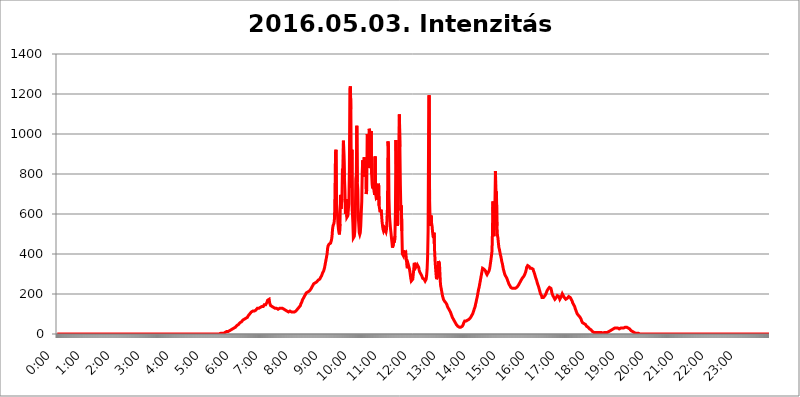
| Category | 2016.05.03. Intenzitás [W/m^2] |
|---|---|
| 0.0 | 0 |
| 0.0006944444444444445 | 0 |
| 0.001388888888888889 | 0 |
| 0.0020833333333333333 | 0 |
| 0.002777777777777778 | 0 |
| 0.003472222222222222 | 0 |
| 0.004166666666666667 | 0 |
| 0.004861111111111111 | 0 |
| 0.005555555555555556 | 0 |
| 0.0062499999999999995 | 0 |
| 0.006944444444444444 | 0 |
| 0.007638888888888889 | 0 |
| 0.008333333333333333 | 0 |
| 0.009027777777777779 | 0 |
| 0.009722222222222222 | 0 |
| 0.010416666666666666 | 0 |
| 0.011111111111111112 | 0 |
| 0.011805555555555555 | 0 |
| 0.012499999999999999 | 0 |
| 0.013194444444444444 | 0 |
| 0.013888888888888888 | 0 |
| 0.014583333333333332 | 0 |
| 0.015277777777777777 | 0 |
| 0.015972222222222224 | 0 |
| 0.016666666666666666 | 0 |
| 0.017361111111111112 | 0 |
| 0.018055555555555557 | 0 |
| 0.01875 | 0 |
| 0.019444444444444445 | 0 |
| 0.02013888888888889 | 0 |
| 0.020833333333333332 | 0 |
| 0.02152777777777778 | 0 |
| 0.022222222222222223 | 0 |
| 0.02291666666666667 | 0 |
| 0.02361111111111111 | 0 |
| 0.024305555555555556 | 0 |
| 0.024999999999999998 | 0 |
| 0.025694444444444447 | 0 |
| 0.02638888888888889 | 0 |
| 0.027083333333333334 | 0 |
| 0.027777777777777776 | 0 |
| 0.02847222222222222 | 0 |
| 0.029166666666666664 | 0 |
| 0.029861111111111113 | 0 |
| 0.030555555555555555 | 0 |
| 0.03125 | 0 |
| 0.03194444444444445 | 0 |
| 0.03263888888888889 | 0 |
| 0.03333333333333333 | 0 |
| 0.034027777777777775 | 0 |
| 0.034722222222222224 | 0 |
| 0.035416666666666666 | 0 |
| 0.036111111111111115 | 0 |
| 0.03680555555555556 | 0 |
| 0.0375 | 0 |
| 0.03819444444444444 | 0 |
| 0.03888888888888889 | 0 |
| 0.03958333333333333 | 0 |
| 0.04027777777777778 | 0 |
| 0.04097222222222222 | 0 |
| 0.041666666666666664 | 0 |
| 0.042361111111111106 | 0 |
| 0.04305555555555556 | 0 |
| 0.043750000000000004 | 0 |
| 0.044444444444444446 | 0 |
| 0.04513888888888889 | 0 |
| 0.04583333333333334 | 0 |
| 0.04652777777777778 | 0 |
| 0.04722222222222222 | 0 |
| 0.04791666666666666 | 0 |
| 0.04861111111111111 | 0 |
| 0.049305555555555554 | 0 |
| 0.049999999999999996 | 0 |
| 0.05069444444444445 | 0 |
| 0.051388888888888894 | 0 |
| 0.052083333333333336 | 0 |
| 0.05277777777777778 | 0 |
| 0.05347222222222222 | 0 |
| 0.05416666666666667 | 0 |
| 0.05486111111111111 | 0 |
| 0.05555555555555555 | 0 |
| 0.05625 | 0 |
| 0.05694444444444444 | 0 |
| 0.057638888888888885 | 0 |
| 0.05833333333333333 | 0 |
| 0.05902777777777778 | 0 |
| 0.059722222222222225 | 0 |
| 0.06041666666666667 | 0 |
| 0.061111111111111116 | 0 |
| 0.06180555555555556 | 0 |
| 0.0625 | 0 |
| 0.06319444444444444 | 0 |
| 0.06388888888888888 | 0 |
| 0.06458333333333334 | 0 |
| 0.06527777777777778 | 0 |
| 0.06597222222222222 | 0 |
| 0.06666666666666667 | 0 |
| 0.06736111111111111 | 0 |
| 0.06805555555555555 | 0 |
| 0.06874999999999999 | 0 |
| 0.06944444444444443 | 0 |
| 0.07013888888888889 | 0 |
| 0.07083333333333333 | 0 |
| 0.07152777777777779 | 0 |
| 0.07222222222222223 | 0 |
| 0.07291666666666667 | 0 |
| 0.07361111111111111 | 0 |
| 0.07430555555555556 | 0 |
| 0.075 | 0 |
| 0.07569444444444444 | 0 |
| 0.0763888888888889 | 0 |
| 0.07708333333333334 | 0 |
| 0.07777777777777778 | 0 |
| 0.07847222222222222 | 0 |
| 0.07916666666666666 | 0 |
| 0.0798611111111111 | 0 |
| 0.08055555555555556 | 0 |
| 0.08125 | 0 |
| 0.08194444444444444 | 0 |
| 0.08263888888888889 | 0 |
| 0.08333333333333333 | 0 |
| 0.08402777777777777 | 0 |
| 0.08472222222222221 | 0 |
| 0.08541666666666665 | 0 |
| 0.08611111111111112 | 0 |
| 0.08680555555555557 | 0 |
| 0.08750000000000001 | 0 |
| 0.08819444444444445 | 0 |
| 0.08888888888888889 | 0 |
| 0.08958333333333333 | 0 |
| 0.09027777777777778 | 0 |
| 0.09097222222222222 | 0 |
| 0.09166666666666667 | 0 |
| 0.09236111111111112 | 0 |
| 0.09305555555555556 | 0 |
| 0.09375 | 0 |
| 0.09444444444444444 | 0 |
| 0.09513888888888888 | 0 |
| 0.09583333333333333 | 0 |
| 0.09652777777777777 | 0 |
| 0.09722222222222222 | 0 |
| 0.09791666666666667 | 0 |
| 0.09861111111111111 | 0 |
| 0.09930555555555555 | 0 |
| 0.09999999999999999 | 0 |
| 0.10069444444444443 | 0 |
| 0.1013888888888889 | 0 |
| 0.10208333333333335 | 0 |
| 0.10277777777777779 | 0 |
| 0.10347222222222223 | 0 |
| 0.10416666666666667 | 0 |
| 0.10486111111111111 | 0 |
| 0.10555555555555556 | 0 |
| 0.10625 | 0 |
| 0.10694444444444444 | 0 |
| 0.1076388888888889 | 0 |
| 0.10833333333333334 | 0 |
| 0.10902777777777778 | 0 |
| 0.10972222222222222 | 0 |
| 0.1111111111111111 | 0 |
| 0.11180555555555556 | 0 |
| 0.11180555555555556 | 0 |
| 0.1125 | 0 |
| 0.11319444444444444 | 0 |
| 0.11388888888888889 | 0 |
| 0.11458333333333333 | 0 |
| 0.11527777777777777 | 0 |
| 0.11597222222222221 | 0 |
| 0.11666666666666665 | 0 |
| 0.1173611111111111 | 0 |
| 0.11805555555555557 | 0 |
| 0.11944444444444445 | 0 |
| 0.12013888888888889 | 0 |
| 0.12083333333333333 | 0 |
| 0.12152777777777778 | 0 |
| 0.12222222222222223 | 0 |
| 0.12291666666666667 | 0 |
| 0.12291666666666667 | 0 |
| 0.12361111111111112 | 0 |
| 0.12430555555555556 | 0 |
| 0.125 | 0 |
| 0.12569444444444444 | 0 |
| 0.12638888888888888 | 0 |
| 0.12708333333333333 | 0 |
| 0.16875 | 0 |
| 0.12847222222222224 | 0 |
| 0.12916666666666668 | 0 |
| 0.12986111111111112 | 0 |
| 0.13055555555555556 | 0 |
| 0.13125 | 0 |
| 0.13194444444444445 | 0 |
| 0.1326388888888889 | 0 |
| 0.13333333333333333 | 0 |
| 0.13402777777777777 | 0 |
| 0.13402777777777777 | 0 |
| 0.13472222222222222 | 0 |
| 0.13541666666666666 | 0 |
| 0.1361111111111111 | 0 |
| 0.13749999999999998 | 0 |
| 0.13819444444444443 | 0 |
| 0.1388888888888889 | 0 |
| 0.13958333333333334 | 0 |
| 0.14027777777777778 | 0 |
| 0.14097222222222222 | 0 |
| 0.14166666666666666 | 0 |
| 0.1423611111111111 | 0 |
| 0.14305555555555557 | 0 |
| 0.14375000000000002 | 0 |
| 0.14444444444444446 | 0 |
| 0.1451388888888889 | 0 |
| 0.1451388888888889 | 0 |
| 0.14652777777777778 | 0 |
| 0.14722222222222223 | 0 |
| 0.14791666666666667 | 0 |
| 0.1486111111111111 | 0 |
| 0.14930555555555555 | 0 |
| 0.15 | 0 |
| 0.15069444444444444 | 0 |
| 0.15138888888888888 | 0 |
| 0.15208333333333332 | 0 |
| 0.15277777777777776 | 0 |
| 0.15347222222222223 | 0 |
| 0.15416666666666667 | 0 |
| 0.15486111111111112 | 0 |
| 0.15555555555555556 | 0 |
| 0.15625 | 0 |
| 0.15694444444444444 | 0 |
| 0.15763888888888888 | 0 |
| 0.15833333333333333 | 0 |
| 0.15902777777777777 | 0 |
| 0.15972222222222224 | 0 |
| 0.16041666666666668 | 0 |
| 0.16111111111111112 | 0 |
| 0.16180555555555556 | 0 |
| 0.1625 | 0 |
| 0.16319444444444445 | 0 |
| 0.1638888888888889 | 0 |
| 0.16458333333333333 | 0 |
| 0.16527777777777777 | 0 |
| 0.16597222222222222 | 0 |
| 0.16666666666666666 | 0 |
| 0.1673611111111111 | 0 |
| 0.16805555555555554 | 0 |
| 0.16874999999999998 | 0 |
| 0.16944444444444443 | 0 |
| 0.17013888888888887 | 0 |
| 0.1708333333333333 | 0 |
| 0.17152777777777775 | 0 |
| 0.17222222222222225 | 0 |
| 0.1729166666666667 | 0 |
| 0.17361111111111113 | 0 |
| 0.17430555555555557 | 0 |
| 0.17500000000000002 | 0 |
| 0.17569444444444446 | 0 |
| 0.1763888888888889 | 0 |
| 0.17708333333333334 | 0 |
| 0.17777777777777778 | 0 |
| 0.17847222222222223 | 0 |
| 0.17916666666666667 | 0 |
| 0.1798611111111111 | 0 |
| 0.18055555555555555 | 0 |
| 0.18125 | 0 |
| 0.18194444444444444 | 0 |
| 0.1826388888888889 | 0 |
| 0.18333333333333335 | 0 |
| 0.1840277777777778 | 0 |
| 0.18472222222222223 | 0 |
| 0.18541666666666667 | 0 |
| 0.18611111111111112 | 0 |
| 0.18680555555555556 | 0 |
| 0.1875 | 0 |
| 0.18819444444444444 | 0 |
| 0.18888888888888888 | 0 |
| 0.18958333333333333 | 0 |
| 0.19027777777777777 | 0 |
| 0.1909722222222222 | 0 |
| 0.19166666666666665 | 0 |
| 0.19236111111111112 | 0 |
| 0.19305555555555554 | 0 |
| 0.19375 | 0 |
| 0.19444444444444445 | 0 |
| 0.1951388888888889 | 0 |
| 0.19583333333333333 | 0 |
| 0.19652777777777777 | 0 |
| 0.19722222222222222 | 0 |
| 0.19791666666666666 | 0 |
| 0.1986111111111111 | 0 |
| 0.19930555555555554 | 0 |
| 0.19999999999999998 | 0 |
| 0.20069444444444443 | 0 |
| 0.20138888888888887 | 0 |
| 0.2020833333333333 | 0 |
| 0.2027777777777778 | 0 |
| 0.2034722222222222 | 0 |
| 0.2041666666666667 | 0 |
| 0.20486111111111113 | 0 |
| 0.20555555555555557 | 0 |
| 0.20625000000000002 | 0 |
| 0.20694444444444446 | 0 |
| 0.2076388888888889 | 0 |
| 0.20833333333333334 | 0 |
| 0.20902777777777778 | 0 |
| 0.20972222222222223 | 0 |
| 0.21041666666666667 | 0 |
| 0.2111111111111111 | 0 |
| 0.21180555555555555 | 0 |
| 0.2125 | 0 |
| 0.21319444444444444 | 0 |
| 0.2138888888888889 | 0 |
| 0.21458333333333335 | 0 |
| 0.2152777777777778 | 0 |
| 0.21597222222222223 | 0 |
| 0.21666666666666667 | 0 |
| 0.21736111111111112 | 0 |
| 0.21805555555555556 | 0 |
| 0.21875 | 0 |
| 0.21944444444444444 | 0 |
| 0.22013888888888888 | 0 |
| 0.22083333333333333 | 0 |
| 0.22152777777777777 | 0 |
| 0.2222222222222222 | 0 |
| 0.22291666666666665 | 0 |
| 0.2236111111111111 | 0 |
| 0.22430555555555556 | 0 |
| 0.225 | 0 |
| 0.22569444444444445 | 3.525 |
| 0.2263888888888889 | 0 |
| 0.22708333333333333 | 0 |
| 0.22777777777777777 | 3.525 |
| 0.22847222222222222 | 3.525 |
| 0.22916666666666666 | 3.525 |
| 0.2298611111111111 | 3.525 |
| 0.23055555555555554 | 3.525 |
| 0.23124999999999998 | 3.525 |
| 0.23194444444444443 | 3.525 |
| 0.23263888888888887 | 3.525 |
| 0.2333333333333333 | 3.525 |
| 0.2340277777777778 | 3.525 |
| 0.2347222222222222 | 7.887 |
| 0.2354166666666667 | 7.887 |
| 0.23611111111111113 | 7.887 |
| 0.23680555555555557 | 7.887 |
| 0.23750000000000002 | 12.257 |
| 0.23819444444444446 | 12.257 |
| 0.2388888888888889 | 12.257 |
| 0.23958333333333334 | 12.257 |
| 0.24027777777777778 | 12.257 |
| 0.24097222222222223 | 12.257 |
| 0.24166666666666667 | 16.636 |
| 0.2423611111111111 | 16.636 |
| 0.24305555555555555 | 16.636 |
| 0.24375 | 21.024 |
| 0.24444444444444446 | 21.024 |
| 0.24513888888888888 | 25.419 |
| 0.24583333333333335 | 25.419 |
| 0.2465277777777778 | 25.419 |
| 0.24722222222222223 | 29.823 |
| 0.24791666666666667 | 29.823 |
| 0.24861111111111112 | 34.234 |
| 0.24930555555555556 | 34.234 |
| 0.25 | 34.234 |
| 0.25069444444444444 | 38.653 |
| 0.2513888888888889 | 38.653 |
| 0.2520833333333333 | 43.079 |
| 0.25277777777777777 | 43.079 |
| 0.2534722222222222 | 47.511 |
| 0.25416666666666665 | 47.511 |
| 0.2548611111111111 | 47.511 |
| 0.2555555555555556 | 51.951 |
| 0.25625000000000003 | 56.398 |
| 0.2569444444444445 | 56.398 |
| 0.2576388888888889 | 60.85 |
| 0.25833333333333336 | 60.85 |
| 0.2590277777777778 | 65.31 |
| 0.25972222222222224 | 65.31 |
| 0.2604166666666667 | 69.775 |
| 0.2611111111111111 | 69.775 |
| 0.26180555555555557 | 74.246 |
| 0.2625 | 74.246 |
| 0.26319444444444445 | 74.246 |
| 0.2638888888888889 | 74.246 |
| 0.26458333333333334 | 78.722 |
| 0.2652777777777778 | 78.722 |
| 0.2659722222222222 | 83.205 |
| 0.26666666666666666 | 83.205 |
| 0.2673611111111111 | 87.692 |
| 0.26805555555555555 | 92.184 |
| 0.26875 | 92.184 |
| 0.26944444444444443 | 96.682 |
| 0.2701388888888889 | 101.184 |
| 0.2708333333333333 | 101.184 |
| 0.27152777777777776 | 105.69 |
| 0.2722222222222222 | 110.201 |
| 0.27291666666666664 | 110.201 |
| 0.2736111111111111 | 110.201 |
| 0.2743055555555555 | 114.716 |
| 0.27499999999999997 | 114.716 |
| 0.27569444444444446 | 114.716 |
| 0.27638888888888885 | 114.716 |
| 0.27708333333333335 | 119.235 |
| 0.2777777777777778 | 119.235 |
| 0.27847222222222223 | 119.235 |
| 0.2791666666666667 | 123.758 |
| 0.2798611111111111 | 123.758 |
| 0.28055555555555556 | 128.284 |
| 0.28125 | 128.284 |
| 0.28194444444444444 | 128.284 |
| 0.2826388888888889 | 128.284 |
| 0.2833333333333333 | 128.284 |
| 0.28402777777777777 | 128.284 |
| 0.2847222222222222 | 132.814 |
| 0.28541666666666665 | 132.814 |
| 0.28611111111111115 | 132.814 |
| 0.28680555555555554 | 137.347 |
| 0.28750000000000003 | 137.347 |
| 0.2881944444444445 | 137.347 |
| 0.2888888888888889 | 137.347 |
| 0.28958333333333336 | 141.884 |
| 0.2902777777777778 | 146.423 |
| 0.29097222222222224 | 146.423 |
| 0.2916666666666667 | 146.423 |
| 0.2923611111111111 | 146.423 |
| 0.29305555555555557 | 150.964 |
| 0.29375 | 155.509 |
| 0.29444444444444445 | 160.056 |
| 0.2951388888888889 | 169.156 |
| 0.29583333333333334 | 173.709 |
| 0.2965277777777778 | 173.709 |
| 0.2972222222222222 | 173.709 |
| 0.29791666666666666 | 155.509 |
| 0.2986111111111111 | 150.964 |
| 0.29930555555555555 | 141.884 |
| 0.3 | 141.884 |
| 0.30069444444444443 | 137.347 |
| 0.3013888888888889 | 137.347 |
| 0.3020833333333333 | 132.814 |
| 0.30277777777777776 | 132.814 |
| 0.3034722222222222 | 132.814 |
| 0.30416666666666664 | 132.814 |
| 0.3048611111111111 | 128.284 |
| 0.3055555555555555 | 128.284 |
| 0.30624999999999997 | 128.284 |
| 0.3069444444444444 | 128.284 |
| 0.3076388888888889 | 128.284 |
| 0.30833333333333335 | 128.284 |
| 0.3090277777777778 | 128.284 |
| 0.30972222222222223 | 123.758 |
| 0.3104166666666667 | 123.758 |
| 0.3111111111111111 | 123.758 |
| 0.31180555555555556 | 128.284 |
| 0.3125 | 123.758 |
| 0.31319444444444444 | 128.284 |
| 0.3138888888888889 | 128.284 |
| 0.3145833333333333 | 128.284 |
| 0.31527777777777777 | 128.284 |
| 0.3159722222222222 | 128.284 |
| 0.31666666666666665 | 123.758 |
| 0.31736111111111115 | 123.758 |
| 0.31805555555555554 | 123.758 |
| 0.31875000000000003 | 119.235 |
| 0.3194444444444445 | 119.235 |
| 0.3201388888888889 | 119.235 |
| 0.32083333333333336 | 119.235 |
| 0.3215277777777778 | 114.716 |
| 0.32222222222222224 | 114.716 |
| 0.3229166666666667 | 114.716 |
| 0.3236111111111111 | 114.716 |
| 0.32430555555555557 | 110.201 |
| 0.325 | 114.716 |
| 0.32569444444444445 | 114.716 |
| 0.3263888888888889 | 114.716 |
| 0.32708333333333334 | 114.716 |
| 0.3277777777777778 | 114.716 |
| 0.3284722222222222 | 110.201 |
| 0.32916666666666666 | 110.201 |
| 0.3298611111111111 | 110.201 |
| 0.33055555555555555 | 110.201 |
| 0.33125 | 110.201 |
| 0.33194444444444443 | 110.201 |
| 0.3326388888888889 | 110.201 |
| 0.3333333333333333 | 110.201 |
| 0.3340277777777778 | 114.716 |
| 0.3347222222222222 | 114.716 |
| 0.3354166666666667 | 119.235 |
| 0.3361111111111111 | 119.235 |
| 0.3368055555555556 | 123.758 |
| 0.33749999999999997 | 128.284 |
| 0.33819444444444446 | 128.284 |
| 0.33888888888888885 | 132.814 |
| 0.33958333333333335 | 132.814 |
| 0.34027777777777773 | 137.347 |
| 0.34097222222222223 | 141.884 |
| 0.3416666666666666 | 150.964 |
| 0.3423611111111111 | 155.509 |
| 0.3430555555555555 | 160.056 |
| 0.34375 | 169.156 |
| 0.3444444444444445 | 173.709 |
| 0.3451388888888889 | 178.264 |
| 0.3458333333333334 | 182.82 |
| 0.34652777777777777 | 187.378 |
| 0.34722222222222227 | 191.937 |
| 0.34791666666666665 | 196.497 |
| 0.34861111111111115 | 201.058 |
| 0.34930555555555554 | 205.62 |
| 0.35000000000000003 | 210.182 |
| 0.3506944444444444 | 210.182 |
| 0.3513888888888889 | 210.182 |
| 0.3520833333333333 | 214.746 |
| 0.3527777777777778 | 214.746 |
| 0.3534722222222222 | 214.746 |
| 0.3541666666666667 | 219.309 |
| 0.3548611111111111 | 219.309 |
| 0.35555555555555557 | 223.873 |
| 0.35625 | 228.436 |
| 0.35694444444444445 | 233 |
| 0.3576388888888889 | 237.564 |
| 0.35833333333333334 | 242.127 |
| 0.3590277777777778 | 246.689 |
| 0.3597222222222222 | 251.251 |
| 0.36041666666666666 | 251.251 |
| 0.3611111111111111 | 255.813 |
| 0.36180555555555555 | 255.813 |
| 0.3625 | 255.813 |
| 0.36319444444444443 | 255.813 |
| 0.3638888888888889 | 260.373 |
| 0.3645833333333333 | 260.373 |
| 0.3652777777777778 | 264.932 |
| 0.3659722222222222 | 269.49 |
| 0.3666666666666667 | 269.49 |
| 0.3673611111111111 | 269.49 |
| 0.3680555555555556 | 274.047 |
| 0.36874999999999997 | 278.603 |
| 0.36944444444444446 | 283.156 |
| 0.37013888888888885 | 287.709 |
| 0.37083333333333335 | 292.259 |
| 0.37152777777777773 | 296.808 |
| 0.37222222222222223 | 305.898 |
| 0.3729166666666666 | 310.44 |
| 0.3736111111111111 | 314.98 |
| 0.3743055555555555 | 324.052 |
| 0.375 | 333.113 |
| 0.3756944444444445 | 346.682 |
| 0.3763888888888889 | 360.221 |
| 0.3770833333333334 | 373.729 |
| 0.37777777777777777 | 387.202 |
| 0.37847222222222227 | 400.638 |
| 0.37916666666666665 | 427.39 |
| 0.37986111111111115 | 440.702 |
| 0.38055555555555554 | 445.129 |
| 0.38125000000000003 | 449.551 |
| 0.3819444444444444 | 453.968 |
| 0.3826388888888889 | 453.968 |
| 0.3833333333333333 | 453.968 |
| 0.3840277777777778 | 458.38 |
| 0.3847222222222222 | 471.582 |
| 0.3854166666666667 | 489.108 |
| 0.3861111111111111 | 523.88 |
| 0.38680555555555557 | 541.121 |
| 0.3875 | 545.416 |
| 0.38819444444444445 | 553.986 |
| 0.3888888888888889 | 579.542 |
| 0.38958333333333334 | 711.832 |
| 0.3902777777777778 | 906.223 |
| 0.3909722222222222 | 921.298 |
| 0.39166666666666666 | 650.667 |
| 0.3923611111111111 | 654.791 |
| 0.39305555555555555 | 596.45 |
| 0.39375 | 549.704 |
| 0.39444444444444443 | 523.88 |
| 0.3951388888888889 | 506.542 |
| 0.3958333333333333 | 497.836 |
| 0.3965277777777778 | 549.704 |
| 0.3972222222222222 | 695.666 |
| 0.3979166666666667 | 625.784 |
| 0.3986111111111111 | 629.948 |
| 0.3993055555555556 | 675.311 |
| 0.39999999999999997 | 826.123 |
| 0.40069444444444446 | 751.803 |
| 0.40138888888888885 | 966.295 |
| 0.40208333333333335 | 962.555 |
| 0.40277777777777773 | 783.342 |
| 0.40347222222222223 | 719.877 |
| 0.4041666666666666 | 600.661 |
| 0.4048611111111111 | 625.784 |
| 0.4055555555555555 | 675.311 |
| 0.40625 | 583.779 |
| 0.4069444444444445 | 579.542 |
| 0.4076388888888889 | 592.233 |
| 0.4083333333333334 | 625.784 |
| 0.40902777777777777 | 650.667 |
| 0.40972222222222227 | 818.392 |
| 0.41041666666666665 | 1225.859 |
| 0.41111111111111115 | 1238.014 |
| 0.41180555555555554 | 1124.056 |
| 0.41250000000000003 | 731.896 |
| 0.4131944444444444 | 921.298 |
| 0.4138888888888889 | 613.252 |
| 0.4145833333333333 | 558.261 |
| 0.4152777777777778 | 480.356 |
| 0.4159722222222222 | 480.356 |
| 0.4166666666666667 | 489.108 |
| 0.4173611111111111 | 515.223 |
| 0.41805555555555557 | 583.779 |
| 0.41875 | 775.492 |
| 0.41944444444444445 | 795.074 |
| 0.4201388888888889 | 1041.019 |
| 0.42083333333333334 | 759.723 |
| 0.4215277777777778 | 723.889 |
| 0.4222222222222222 | 588.009 |
| 0.42291666666666666 | 545.416 |
| 0.4236111111111111 | 506.542 |
| 0.42430555555555555 | 497.836 |
| 0.425 | 506.542 |
| 0.42569444444444443 | 541.121 |
| 0.4263888888888889 | 604.864 |
| 0.4270833333333333 | 663.019 |
| 0.4277777777777778 | 810.641 |
| 0.4284722222222222 | 868.305 |
| 0.4291666666666667 | 787.258 |
| 0.4298611111111111 | 810.641 |
| 0.4305555555555556 | 883.516 |
| 0.43124999999999997 | 818.392 |
| 0.43194444444444446 | 864.493 |
| 0.43263888888888885 | 853.029 |
| 0.43333333333333335 | 699.717 |
| 0.43402777777777773 | 719.877 |
| 0.43472222222222223 | 999.916 |
| 0.4354166666666666 | 988.714 |
| 0.4361111111111111 | 829.981 |
| 0.4368055555555555 | 845.365 |
| 0.4375 | 1026.06 |
| 0.4381944444444445 | 1014.852 |
| 0.4388888888888889 | 829.981 |
| 0.4395833333333334 | 883.516 |
| 0.44027777777777777 | 1014.852 |
| 0.44097222222222227 | 798.974 |
| 0.44166666666666665 | 747.834 |
| 0.44236111111111115 | 727.896 |
| 0.44305555555555554 | 755.766 |
| 0.44375000000000003 | 727.896 |
| 0.4444444444444444 | 711.832 |
| 0.4451388888888889 | 695.666 |
| 0.4458333333333333 | 887.309 |
| 0.4465277777777778 | 699.717 |
| 0.4472222222222222 | 683.473 |
| 0.4479166666666667 | 679.395 |
| 0.4486111111111111 | 691.608 |
| 0.44930555555555557 | 671.22 |
| 0.45 | 679.395 |
| 0.45069444444444445 | 751.803 |
| 0.4513888888888889 | 642.4 |
| 0.45208333333333334 | 625.784 |
| 0.4527777777777778 | 609.062 |
| 0.4534722222222222 | 609.062 |
| 0.45416666666666666 | 621.613 |
| 0.4548611111111111 | 596.45 |
| 0.45555555555555555 | 562.53 |
| 0.45625 | 541.121 |
| 0.45694444444444443 | 523.88 |
| 0.4576388888888889 | 515.223 |
| 0.4583333333333333 | 519.555 |
| 0.4590277777777778 | 528.2 |
| 0.4597222222222222 | 532.513 |
| 0.4604166666666667 | 523.88 |
| 0.4611111111111111 | 510.885 |
| 0.4618055555555556 | 523.88 |
| 0.46249999999999997 | 575.299 |
| 0.46319444444444446 | 634.105 |
| 0.46388888888888885 | 962.555 |
| 0.46458333333333335 | 932.576 |
| 0.46527777777777773 | 675.311 |
| 0.46597222222222223 | 592.233 |
| 0.4666666666666666 | 558.261 |
| 0.4673611111111111 | 528.2 |
| 0.4680555555555555 | 506.542 |
| 0.46875 | 480.356 |
| 0.4694444444444445 | 458.38 |
| 0.4701388888888889 | 431.833 |
| 0.4708333333333334 | 431.833 |
| 0.47152777777777777 | 449.551 |
| 0.47222222222222227 | 480.356 |
| 0.47291666666666665 | 458.38 |
| 0.47361111111111115 | 489.108 |
| 0.47430555555555554 | 613.252 |
| 0.47500000000000003 | 970.034 |
| 0.4756944444444444 | 837.682 |
| 0.4763888888888889 | 617.436 |
| 0.4770833333333333 | 541.121 |
| 0.4777777777777778 | 553.986 |
| 0.4784722222222222 | 822.26 |
| 0.4791666666666667 | 814.519 |
| 0.4798611111111111 | 1097.437 |
| 0.48055555555555557 | 936.33 |
| 0.48125 | 743.859 |
| 0.48194444444444445 | 617.436 |
| 0.4826388888888889 | 642.4 |
| 0.48333333333333334 | 515.223 |
| 0.4840277777777778 | 400.638 |
| 0.4847222222222222 | 400.638 |
| 0.48541666666666666 | 391.685 |
| 0.4861111111111111 | 418.492 |
| 0.48680555555555555 | 396.164 |
| 0.4875 | 396.164 |
| 0.48819444444444443 | 400.638 |
| 0.4888888888888889 | 405.108 |
| 0.4895833333333333 | 378.224 |
| 0.4902777777777778 | 346.682 |
| 0.4909722222222222 | 328.584 |
| 0.4916666666666667 | 337.639 |
| 0.4923611111111111 | 346.682 |
| 0.4930555555555556 | 337.639 |
| 0.49374999999999997 | 328.584 |
| 0.49444444444444446 | 314.98 |
| 0.49513888888888885 | 296.808 |
| 0.49583333333333335 | 278.603 |
| 0.49652777777777773 | 264.932 |
| 0.49722222222222223 | 260.373 |
| 0.4979166666666666 | 260.373 |
| 0.4986111111111111 | 274.047 |
| 0.4993055555555555 | 296.808 |
| 0.5 | 324.052 |
| 0.5006944444444444 | 355.712 |
| 0.5013888888888889 | 360.221 |
| 0.5020833333333333 | 342.162 |
| 0.5027777777777778 | 333.113 |
| 0.5034722222222222 | 333.113 |
| 0.5041666666666667 | 337.639 |
| 0.5048611111111111 | 346.682 |
| 0.5055555555555555 | 351.198 |
| 0.50625 | 346.682 |
| 0.5069444444444444 | 333.113 |
| 0.5076388888888889 | 319.517 |
| 0.5083333333333333 | 310.44 |
| 0.5090277777777777 | 305.898 |
| 0.5097222222222222 | 301.354 |
| 0.5104166666666666 | 296.808 |
| 0.5111111111111112 | 292.259 |
| 0.5118055555555555 | 287.709 |
| 0.5125000000000001 | 278.603 |
| 0.5131944444444444 | 278.603 |
| 0.513888888888889 | 278.603 |
| 0.5145833333333333 | 274.047 |
| 0.5152777777777778 | 269.49 |
| 0.5159722222222222 | 264.932 |
| 0.5166666666666667 | 264.932 |
| 0.517361111111111 | 274.047 |
| 0.5180555555555556 | 292.259 |
| 0.5187499999999999 | 324.052 |
| 0.5194444444444445 | 387.202 |
| 0.5201388888888888 | 515.223 |
| 0.5208333333333334 | 1003.65 |
| 0.5215277777777778 | 1193.918 |
| 0.5222222222222223 | 671.22 |
| 0.5229166666666667 | 571.049 |
| 0.5236111111111111 | 541.121 |
| 0.5243055555555556 | 592.233 |
| 0.525 | 553.986 |
| 0.5256944444444445 | 541.121 |
| 0.5263888888888889 | 510.885 |
| 0.5270833333333333 | 489.108 |
| 0.5277777777777778 | 480.356 |
| 0.5284722222222222 | 506.542 |
| 0.5291666666666667 | 422.943 |
| 0.5298611111111111 | 369.23 |
| 0.5305555555555556 | 333.113 |
| 0.53125 | 301.354 |
| 0.5319444444444444 | 274.047 |
| 0.5326388888888889 | 274.047 |
| 0.5333333333333333 | 287.709 |
| 0.5340277777777778 | 333.113 |
| 0.5347222222222222 | 364.728 |
| 0.5354166666666667 | 364.728 |
| 0.5361111111111111 | 351.198 |
| 0.5368055555555555 | 296.808 |
| 0.5375 | 246.689 |
| 0.5381944444444444 | 233 |
| 0.5388888888888889 | 219.309 |
| 0.5395833333333333 | 205.62 |
| 0.5402777777777777 | 191.937 |
| 0.5409722222222222 | 182.82 |
| 0.5416666666666666 | 173.709 |
| 0.5423611111111112 | 169.156 |
| 0.5430555555555555 | 164.605 |
| 0.5437500000000001 | 164.605 |
| 0.5444444444444444 | 160.056 |
| 0.545138888888889 | 155.509 |
| 0.5458333333333333 | 150.964 |
| 0.5465277777777778 | 146.423 |
| 0.5472222222222222 | 137.347 |
| 0.5479166666666667 | 137.347 |
| 0.548611111111111 | 128.284 |
| 0.5493055555555556 | 128.284 |
| 0.5499999999999999 | 119.235 |
| 0.5506944444444445 | 114.716 |
| 0.5513888888888888 | 110.201 |
| 0.5520833333333334 | 105.69 |
| 0.5527777777777778 | 96.682 |
| 0.5534722222222223 | 92.184 |
| 0.5541666666666667 | 83.205 |
| 0.5548611111111111 | 78.722 |
| 0.5555555555555556 | 74.246 |
| 0.55625 | 69.775 |
| 0.5569444444444445 | 65.31 |
| 0.5576388888888889 | 60.85 |
| 0.5583333333333333 | 56.398 |
| 0.5590277777777778 | 51.951 |
| 0.5597222222222222 | 47.511 |
| 0.5604166666666667 | 47.511 |
| 0.5611111111111111 | 43.079 |
| 0.5618055555555556 | 38.653 |
| 0.5625 | 38.653 |
| 0.5631944444444444 | 38.653 |
| 0.5638888888888889 | 34.234 |
| 0.5645833333333333 | 29.823 |
| 0.5652777777777778 | 29.823 |
| 0.5659722222222222 | 34.234 |
| 0.5666666666666667 | 34.234 |
| 0.5673611111111111 | 34.234 |
| 0.5680555555555555 | 38.653 |
| 0.56875 | 43.079 |
| 0.5694444444444444 | 47.511 |
| 0.5701388888888889 | 56.398 |
| 0.5708333333333333 | 60.85 |
| 0.5715277777777777 | 65.31 |
| 0.5722222222222222 | 65.31 |
| 0.5729166666666666 | 65.31 |
| 0.5736111111111112 | 65.31 |
| 0.5743055555555555 | 65.31 |
| 0.5750000000000001 | 65.31 |
| 0.5756944444444444 | 69.775 |
| 0.576388888888889 | 69.775 |
| 0.5770833333333333 | 74.246 |
| 0.5777777777777778 | 74.246 |
| 0.5784722222222222 | 78.722 |
| 0.5791666666666667 | 78.722 |
| 0.579861111111111 | 83.205 |
| 0.5805555555555556 | 87.692 |
| 0.5812499999999999 | 92.184 |
| 0.5819444444444445 | 96.682 |
| 0.5826388888888888 | 101.184 |
| 0.5833333333333334 | 105.69 |
| 0.5840277777777778 | 114.716 |
| 0.5847222222222223 | 123.758 |
| 0.5854166666666667 | 128.284 |
| 0.5861111111111111 | 137.347 |
| 0.5868055555555556 | 150.964 |
| 0.5875 | 160.056 |
| 0.5881944444444445 | 173.709 |
| 0.5888888888888889 | 182.82 |
| 0.5895833333333333 | 196.497 |
| 0.5902777777777778 | 210.182 |
| 0.5909722222222222 | 223.873 |
| 0.5916666666666667 | 233 |
| 0.5923611111111111 | 246.689 |
| 0.5930555555555556 | 260.373 |
| 0.59375 | 274.047 |
| 0.5944444444444444 | 287.709 |
| 0.5951388888888889 | 301.354 |
| 0.5958333333333333 | 314.98 |
| 0.5965277777777778 | 328.584 |
| 0.5972222222222222 | 333.113 |
| 0.5979166666666667 | 328.584 |
| 0.5986111111111111 | 324.052 |
| 0.5993055555555555 | 319.517 |
| 0.6 | 319.517 |
| 0.6006944444444444 | 314.98 |
| 0.6013888888888889 | 305.898 |
| 0.6020833333333333 | 301.354 |
| 0.6027777777777777 | 296.808 |
| 0.6034722222222222 | 296.808 |
| 0.6041666666666666 | 305.898 |
| 0.6048611111111112 | 310.44 |
| 0.6055555555555555 | 314.98 |
| 0.6062500000000001 | 324.052 |
| 0.6069444444444444 | 337.639 |
| 0.607638888888889 | 355.712 |
| 0.6083333333333333 | 373.729 |
| 0.6090277777777778 | 391.685 |
| 0.6097222222222222 | 414.035 |
| 0.6104166666666667 | 506.542 |
| 0.611111111111111 | 663.019 |
| 0.6118055555555556 | 510.885 |
| 0.6124999999999999 | 489.108 |
| 0.6131944444444445 | 575.299 |
| 0.6138888888888888 | 658.909 |
| 0.6145833333333334 | 814.519 |
| 0.6152777777777778 | 663.019 |
| 0.6159722222222223 | 711.832 |
| 0.6166666666666667 | 541.121 |
| 0.6173611111111111 | 493.475 |
| 0.6180555555555556 | 480.356 |
| 0.61875 | 453.968 |
| 0.6194444444444445 | 431.833 |
| 0.6201388888888889 | 422.943 |
| 0.6208333333333333 | 409.574 |
| 0.6215277777777778 | 396.164 |
| 0.6222222222222222 | 387.202 |
| 0.6229166666666667 | 373.729 |
| 0.6236111111111111 | 360.221 |
| 0.6243055555555556 | 351.198 |
| 0.625 | 337.639 |
| 0.6256944444444444 | 324.052 |
| 0.6263888888888889 | 314.98 |
| 0.6270833333333333 | 305.898 |
| 0.6277777777777778 | 296.808 |
| 0.6284722222222222 | 292.259 |
| 0.6291666666666667 | 287.709 |
| 0.6298611111111111 | 283.156 |
| 0.6305555555555555 | 278.603 |
| 0.63125 | 274.047 |
| 0.6319444444444444 | 264.932 |
| 0.6326388888888889 | 260.373 |
| 0.6333333333333333 | 251.251 |
| 0.6340277777777777 | 246.689 |
| 0.6347222222222222 | 242.127 |
| 0.6354166666666666 | 237.564 |
| 0.6361111111111112 | 233 |
| 0.6368055555555555 | 228.436 |
| 0.6375000000000001 | 228.436 |
| 0.6381944444444444 | 228.436 |
| 0.638888888888889 | 228.436 |
| 0.6395833333333333 | 228.436 |
| 0.6402777777777778 | 228.436 |
| 0.6409722222222222 | 228.436 |
| 0.6416666666666667 | 228.436 |
| 0.642361111111111 | 228.436 |
| 0.6430555555555556 | 228.436 |
| 0.6437499999999999 | 228.436 |
| 0.6444444444444445 | 233 |
| 0.6451388888888888 | 233 |
| 0.6458333333333334 | 237.564 |
| 0.6465277777777778 | 242.127 |
| 0.6472222222222223 | 246.689 |
| 0.6479166666666667 | 251.251 |
| 0.6486111111111111 | 255.813 |
| 0.6493055555555556 | 260.373 |
| 0.65 | 264.932 |
| 0.6506944444444445 | 269.49 |
| 0.6513888888888889 | 274.047 |
| 0.6520833333333333 | 278.603 |
| 0.6527777777777778 | 283.156 |
| 0.6534722222222222 | 283.156 |
| 0.6541666666666667 | 287.709 |
| 0.6548611111111111 | 292.259 |
| 0.6555555555555556 | 296.808 |
| 0.65625 | 301.354 |
| 0.6569444444444444 | 310.44 |
| 0.6576388888888889 | 319.517 |
| 0.6583333333333333 | 333.113 |
| 0.6590277777777778 | 337.639 |
| 0.6597222222222222 | 342.162 |
| 0.6604166666666667 | 337.639 |
| 0.6611111111111111 | 337.639 |
| 0.6618055555555555 | 337.639 |
| 0.6625 | 333.113 |
| 0.6631944444444444 | 328.584 |
| 0.6638888888888889 | 328.584 |
| 0.6645833333333333 | 328.584 |
| 0.6652777777777777 | 328.584 |
| 0.6659722222222222 | 333.113 |
| 0.6666666666666666 | 328.584 |
| 0.6673611111111111 | 324.052 |
| 0.6680555555555556 | 314.98 |
| 0.6687500000000001 | 310.44 |
| 0.6694444444444444 | 301.354 |
| 0.6701388888888888 | 292.259 |
| 0.6708333333333334 | 283.156 |
| 0.6715277777777778 | 278.603 |
| 0.6722222222222222 | 269.49 |
| 0.6729166666666666 | 260.373 |
| 0.6736111111111112 | 251.251 |
| 0.6743055555555556 | 246.689 |
| 0.6749999999999999 | 237.564 |
| 0.6756944444444444 | 228.436 |
| 0.6763888888888889 | 219.309 |
| 0.6770833333333334 | 210.182 |
| 0.6777777777777777 | 201.058 |
| 0.6784722222222223 | 196.497 |
| 0.6791666666666667 | 191.937 |
| 0.6798611111111111 | 182.82 |
| 0.6805555555555555 | 182.82 |
| 0.68125 | 178.264 |
| 0.6819444444444445 | 182.82 |
| 0.6826388888888889 | 182.82 |
| 0.6833333333333332 | 187.378 |
| 0.6840277777777778 | 191.937 |
| 0.6847222222222222 | 196.497 |
| 0.6854166666666667 | 201.058 |
| 0.686111111111111 | 205.62 |
| 0.6868055555555556 | 214.746 |
| 0.6875 | 219.309 |
| 0.6881944444444444 | 223.873 |
| 0.688888888888889 | 228.436 |
| 0.6895833333333333 | 228.436 |
| 0.6902777777777778 | 233 |
| 0.6909722222222222 | 233 |
| 0.6916666666666668 | 233 |
| 0.6923611111111111 | 228.436 |
| 0.6930555555555555 | 219.309 |
| 0.69375 | 205.62 |
| 0.6944444444444445 | 201.058 |
| 0.6951388888888889 | 191.937 |
| 0.6958333333333333 | 187.378 |
| 0.6965277777777777 | 182.82 |
| 0.6972222222222223 | 178.264 |
| 0.6979166666666666 | 173.709 |
| 0.6986111111111111 | 173.709 |
| 0.6993055555555556 | 178.264 |
| 0.7000000000000001 | 182.82 |
| 0.7006944444444444 | 187.378 |
| 0.7013888888888888 | 191.937 |
| 0.7020833333333334 | 191.937 |
| 0.7027777777777778 | 191.937 |
| 0.7034722222222222 | 187.378 |
| 0.7041666666666666 | 182.82 |
| 0.7048611111111112 | 173.709 |
| 0.7055555555555556 | 173.709 |
| 0.7062499999999999 | 173.709 |
| 0.7069444444444444 | 187.378 |
| 0.7076388888888889 | 191.937 |
| 0.7083333333333334 | 201.058 |
| 0.7090277777777777 | 201.058 |
| 0.7097222222222223 | 191.937 |
| 0.7104166666666667 | 187.378 |
| 0.7111111111111111 | 182.82 |
| 0.7118055555555555 | 178.264 |
| 0.7125 | 178.264 |
| 0.7131944444444445 | 173.709 |
| 0.7138888888888889 | 173.709 |
| 0.7145833333333332 | 173.709 |
| 0.7152777777777778 | 178.264 |
| 0.7159722222222222 | 182.82 |
| 0.7166666666666667 | 182.82 |
| 0.717361111111111 | 187.378 |
| 0.7180555555555556 | 187.378 |
| 0.71875 | 182.82 |
| 0.7194444444444444 | 182.82 |
| 0.720138888888889 | 178.264 |
| 0.7208333333333333 | 173.709 |
| 0.7215277777777778 | 169.156 |
| 0.7222222222222222 | 164.605 |
| 0.7229166666666668 | 155.509 |
| 0.7236111111111111 | 150.964 |
| 0.7243055555555555 | 146.423 |
| 0.725 | 141.884 |
| 0.7256944444444445 | 137.347 |
| 0.7263888888888889 | 128.284 |
| 0.7270833333333333 | 123.758 |
| 0.7277777777777777 | 114.716 |
| 0.7284722222222223 | 110.201 |
| 0.7291666666666666 | 101.184 |
| 0.7298611111111111 | 101.184 |
| 0.7305555555555556 | 96.682 |
| 0.7312500000000001 | 92.184 |
| 0.7319444444444444 | 92.184 |
| 0.7326388888888888 | 87.692 |
| 0.7333333333333334 | 83.205 |
| 0.7340277777777778 | 78.722 |
| 0.7347222222222222 | 74.246 |
| 0.7354166666666666 | 65.31 |
| 0.7361111111111112 | 60.85 |
| 0.7368055555555556 | 56.398 |
| 0.7374999999999999 | 56.398 |
| 0.7381944444444444 | 51.951 |
| 0.7388888888888889 | 51.951 |
| 0.7395833333333334 | 51.951 |
| 0.7402777777777777 | 51.951 |
| 0.7409722222222223 | 47.511 |
| 0.7416666666666667 | 43.079 |
| 0.7423611111111111 | 38.653 |
| 0.7430555555555555 | 38.653 |
| 0.74375 | 34.234 |
| 0.7444444444444445 | 34.234 |
| 0.7451388888888889 | 29.823 |
| 0.7458333333333332 | 29.823 |
| 0.7465277777777778 | 25.419 |
| 0.7472222222222222 | 25.419 |
| 0.7479166666666667 | 21.024 |
| 0.748611111111111 | 21.024 |
| 0.7493055555555556 | 16.636 |
| 0.75 | 16.636 |
| 0.7506944444444444 | 12.257 |
| 0.751388888888889 | 12.257 |
| 0.7520833333333333 | 12.257 |
| 0.7527777777777778 | 7.887 |
| 0.7534722222222222 | 7.887 |
| 0.7541666666666668 | 7.887 |
| 0.7548611111111111 | 7.887 |
| 0.7555555555555555 | 7.887 |
| 0.75625 | 7.887 |
| 0.7569444444444445 | 7.887 |
| 0.7576388888888889 | 7.887 |
| 0.7583333333333333 | 7.887 |
| 0.7590277777777777 | 7.887 |
| 0.7597222222222223 | 7.887 |
| 0.7604166666666666 | 7.887 |
| 0.7611111111111111 | 7.887 |
| 0.7618055555555556 | 7.887 |
| 0.7625000000000001 | 7.887 |
| 0.7631944444444444 | 7.887 |
| 0.7638888888888888 | 7.887 |
| 0.7645833333333334 | 3.525 |
| 0.7652777777777778 | 3.525 |
| 0.7659722222222222 | 7.887 |
| 0.7666666666666666 | 7.887 |
| 0.7673611111111112 | 7.887 |
| 0.7680555555555556 | 7.887 |
| 0.7687499999999999 | 7.887 |
| 0.7694444444444444 | 7.887 |
| 0.7701388888888889 | 7.887 |
| 0.7708333333333334 | 7.887 |
| 0.7715277777777777 | 7.887 |
| 0.7722222222222223 | 12.257 |
| 0.7729166666666667 | 12.257 |
| 0.7736111111111111 | 12.257 |
| 0.7743055555555555 | 12.257 |
| 0.775 | 16.636 |
| 0.7756944444444445 | 16.636 |
| 0.7763888888888889 | 21.024 |
| 0.7770833333333332 | 21.024 |
| 0.7777777777777778 | 21.024 |
| 0.7784722222222222 | 21.024 |
| 0.7791666666666667 | 25.419 |
| 0.779861111111111 | 25.419 |
| 0.7805555555555556 | 25.419 |
| 0.78125 | 29.823 |
| 0.7819444444444444 | 29.823 |
| 0.782638888888889 | 29.823 |
| 0.7833333333333333 | 29.823 |
| 0.7840277777777778 | 29.823 |
| 0.7847222222222222 | 29.823 |
| 0.7854166666666668 | 29.823 |
| 0.7861111111111111 | 29.823 |
| 0.7868055555555555 | 29.823 |
| 0.7875 | 25.419 |
| 0.7881944444444445 | 25.419 |
| 0.7888888888888889 | 25.419 |
| 0.7895833333333333 | 29.823 |
| 0.7902777777777777 | 29.823 |
| 0.7909722222222223 | 29.823 |
| 0.7916666666666666 | 29.823 |
| 0.7923611111111111 | 29.823 |
| 0.7930555555555556 | 29.823 |
| 0.7937500000000001 | 29.823 |
| 0.7944444444444444 | 29.823 |
| 0.7951388888888888 | 29.823 |
| 0.7958333333333334 | 29.823 |
| 0.7965277777777778 | 34.234 |
| 0.7972222222222222 | 34.234 |
| 0.7979166666666666 | 34.234 |
| 0.7986111111111112 | 34.234 |
| 0.7993055555555556 | 34.234 |
| 0.7999999999999999 | 34.234 |
| 0.8006944444444444 | 29.823 |
| 0.8013888888888889 | 29.823 |
| 0.8020833333333334 | 25.419 |
| 0.8027777777777777 | 25.419 |
| 0.8034722222222223 | 21.024 |
| 0.8041666666666667 | 21.024 |
| 0.8048611111111111 | 16.636 |
| 0.8055555555555555 | 16.636 |
| 0.80625 | 12.257 |
| 0.8069444444444445 | 12.257 |
| 0.8076388888888889 | 12.257 |
| 0.8083333333333332 | 12.257 |
| 0.8090277777777778 | 7.887 |
| 0.8097222222222222 | 7.887 |
| 0.8104166666666667 | 7.887 |
| 0.811111111111111 | 3.525 |
| 0.8118055555555556 | 3.525 |
| 0.8125 | 3.525 |
| 0.8131944444444444 | 3.525 |
| 0.813888888888889 | 3.525 |
| 0.8145833333333333 | 3.525 |
| 0.8152777777777778 | 3.525 |
| 0.8159722222222222 | 3.525 |
| 0.8166666666666668 | 0 |
| 0.8173611111111111 | 0 |
| 0.8180555555555555 | 0 |
| 0.81875 | 0 |
| 0.8194444444444445 | 0 |
| 0.8201388888888889 | 0 |
| 0.8208333333333333 | 0 |
| 0.8215277777777777 | 0 |
| 0.8222222222222223 | 0 |
| 0.8229166666666666 | 0 |
| 0.8236111111111111 | 0 |
| 0.8243055555555556 | 0 |
| 0.8250000000000001 | 0 |
| 0.8256944444444444 | 0 |
| 0.8263888888888888 | 0 |
| 0.8270833333333334 | 0 |
| 0.8277777777777778 | 0 |
| 0.8284722222222222 | 0 |
| 0.8291666666666666 | 0 |
| 0.8298611111111112 | 0 |
| 0.8305555555555556 | 0 |
| 0.8312499999999999 | 0 |
| 0.8319444444444444 | 0 |
| 0.8326388888888889 | 0 |
| 0.8333333333333334 | 0 |
| 0.8340277777777777 | 0 |
| 0.8347222222222223 | 0 |
| 0.8354166666666667 | 0 |
| 0.8361111111111111 | 0 |
| 0.8368055555555555 | 0 |
| 0.8375 | 0 |
| 0.8381944444444445 | 0 |
| 0.8388888888888889 | 0 |
| 0.8395833333333332 | 0 |
| 0.8402777777777778 | 0 |
| 0.8409722222222222 | 0 |
| 0.8416666666666667 | 0 |
| 0.842361111111111 | 0 |
| 0.8430555555555556 | 0 |
| 0.84375 | 0 |
| 0.8444444444444444 | 0 |
| 0.845138888888889 | 0 |
| 0.8458333333333333 | 0 |
| 0.8465277777777778 | 0 |
| 0.8472222222222222 | 0 |
| 0.8479166666666668 | 0 |
| 0.8486111111111111 | 0 |
| 0.8493055555555555 | 0 |
| 0.85 | 0 |
| 0.8506944444444445 | 0 |
| 0.8513888888888889 | 0 |
| 0.8520833333333333 | 0 |
| 0.8527777777777777 | 0 |
| 0.8534722222222223 | 0 |
| 0.8541666666666666 | 0 |
| 0.8548611111111111 | 0 |
| 0.8555555555555556 | 0 |
| 0.8562500000000001 | 0 |
| 0.8569444444444444 | 0 |
| 0.8576388888888888 | 0 |
| 0.8583333333333334 | 0 |
| 0.8590277777777778 | 0 |
| 0.8597222222222222 | 0 |
| 0.8604166666666666 | 0 |
| 0.8611111111111112 | 0 |
| 0.8618055555555556 | 0 |
| 0.8624999999999999 | 0 |
| 0.8631944444444444 | 0 |
| 0.8638888888888889 | 0 |
| 0.8645833333333334 | 0 |
| 0.8652777777777777 | 0 |
| 0.8659722222222223 | 0 |
| 0.8666666666666667 | 0 |
| 0.8673611111111111 | 0 |
| 0.8680555555555555 | 0 |
| 0.86875 | 0 |
| 0.8694444444444445 | 0 |
| 0.8701388888888889 | 0 |
| 0.8708333333333332 | 0 |
| 0.8715277777777778 | 0 |
| 0.8722222222222222 | 0 |
| 0.8729166666666667 | 0 |
| 0.873611111111111 | 0 |
| 0.8743055555555556 | 0 |
| 0.875 | 0 |
| 0.8756944444444444 | 0 |
| 0.876388888888889 | 0 |
| 0.8770833333333333 | 0 |
| 0.8777777777777778 | 0 |
| 0.8784722222222222 | 0 |
| 0.8791666666666668 | 0 |
| 0.8798611111111111 | 0 |
| 0.8805555555555555 | 0 |
| 0.88125 | 0 |
| 0.8819444444444445 | 0 |
| 0.8826388888888889 | 0 |
| 0.8833333333333333 | 0 |
| 0.8840277777777777 | 0 |
| 0.8847222222222223 | 0 |
| 0.8854166666666666 | 0 |
| 0.8861111111111111 | 0 |
| 0.8868055555555556 | 0 |
| 0.8875000000000001 | 0 |
| 0.8881944444444444 | 0 |
| 0.8888888888888888 | 0 |
| 0.8895833333333334 | 0 |
| 0.8902777777777778 | 0 |
| 0.8909722222222222 | 0 |
| 0.8916666666666666 | 0 |
| 0.8923611111111112 | 0 |
| 0.8930555555555556 | 0 |
| 0.8937499999999999 | 0 |
| 0.8944444444444444 | 0 |
| 0.8951388888888889 | 0 |
| 0.8958333333333334 | 0 |
| 0.8965277777777777 | 0 |
| 0.8972222222222223 | 0 |
| 0.8979166666666667 | 0 |
| 0.8986111111111111 | 0 |
| 0.8993055555555555 | 0 |
| 0.9 | 0 |
| 0.9006944444444445 | 0 |
| 0.9013888888888889 | 0 |
| 0.9020833333333332 | 0 |
| 0.9027777777777778 | 0 |
| 0.9034722222222222 | 0 |
| 0.9041666666666667 | 0 |
| 0.904861111111111 | 0 |
| 0.9055555555555556 | 0 |
| 0.90625 | 0 |
| 0.9069444444444444 | 0 |
| 0.907638888888889 | 0 |
| 0.9083333333333333 | 0 |
| 0.9090277777777778 | 0 |
| 0.9097222222222222 | 0 |
| 0.9104166666666668 | 0 |
| 0.9111111111111111 | 0 |
| 0.9118055555555555 | 0 |
| 0.9125 | 0 |
| 0.9131944444444445 | 0 |
| 0.9138888888888889 | 0 |
| 0.9145833333333333 | 0 |
| 0.9152777777777777 | 0 |
| 0.9159722222222223 | 0 |
| 0.9166666666666666 | 0 |
| 0.9173611111111111 | 0 |
| 0.9180555555555556 | 0 |
| 0.9187500000000001 | 0 |
| 0.9194444444444444 | 0 |
| 0.9201388888888888 | 0 |
| 0.9208333333333334 | 0 |
| 0.9215277777777778 | 0 |
| 0.9222222222222222 | 0 |
| 0.9229166666666666 | 0 |
| 0.9236111111111112 | 0 |
| 0.9243055555555556 | 0 |
| 0.9249999999999999 | 0 |
| 0.9256944444444444 | 0 |
| 0.9263888888888889 | 0 |
| 0.9270833333333334 | 0 |
| 0.9277777777777777 | 0 |
| 0.9284722222222223 | 0 |
| 0.9291666666666667 | 0 |
| 0.9298611111111111 | 0 |
| 0.9305555555555555 | 0 |
| 0.93125 | 0 |
| 0.9319444444444445 | 0 |
| 0.9326388888888889 | 0 |
| 0.9333333333333332 | 0 |
| 0.9340277777777778 | 0 |
| 0.9347222222222222 | 0 |
| 0.9354166666666667 | 0 |
| 0.936111111111111 | 0 |
| 0.9368055555555556 | 0 |
| 0.9375 | 0 |
| 0.9381944444444444 | 0 |
| 0.938888888888889 | 0 |
| 0.9395833333333333 | 0 |
| 0.9402777777777778 | 0 |
| 0.9409722222222222 | 0 |
| 0.9416666666666668 | 0 |
| 0.9423611111111111 | 0 |
| 0.9430555555555555 | 0 |
| 0.94375 | 0 |
| 0.9444444444444445 | 0 |
| 0.9451388888888889 | 0 |
| 0.9458333333333333 | 0 |
| 0.9465277777777777 | 0 |
| 0.9472222222222223 | 0 |
| 0.9479166666666666 | 0 |
| 0.9486111111111111 | 0 |
| 0.9493055555555556 | 0 |
| 0.9500000000000001 | 0 |
| 0.9506944444444444 | 0 |
| 0.9513888888888888 | 0 |
| 0.9520833333333334 | 0 |
| 0.9527777777777778 | 0 |
| 0.9534722222222222 | 0 |
| 0.9541666666666666 | 0 |
| 0.9548611111111112 | 0 |
| 0.9555555555555556 | 0 |
| 0.9562499999999999 | 0 |
| 0.9569444444444444 | 0 |
| 0.9576388888888889 | 0 |
| 0.9583333333333334 | 0 |
| 0.9590277777777777 | 0 |
| 0.9597222222222223 | 0 |
| 0.9604166666666667 | 0 |
| 0.9611111111111111 | 0 |
| 0.9618055555555555 | 0 |
| 0.9625 | 0 |
| 0.9631944444444445 | 0 |
| 0.9638888888888889 | 0 |
| 0.9645833333333332 | 0 |
| 0.9652777777777778 | 0 |
| 0.9659722222222222 | 0 |
| 0.9666666666666667 | 0 |
| 0.967361111111111 | 0 |
| 0.9680555555555556 | 0 |
| 0.96875 | 0 |
| 0.9694444444444444 | 0 |
| 0.970138888888889 | 0 |
| 0.9708333333333333 | 0 |
| 0.9715277777777778 | 0 |
| 0.9722222222222222 | 0 |
| 0.9729166666666668 | 0 |
| 0.9736111111111111 | 0 |
| 0.9743055555555555 | 0 |
| 0.975 | 0 |
| 0.9756944444444445 | 0 |
| 0.9763888888888889 | 0 |
| 0.9770833333333333 | 0 |
| 0.9777777777777777 | 0 |
| 0.9784722222222223 | 0 |
| 0.9791666666666666 | 0 |
| 0.9798611111111111 | 0 |
| 0.9805555555555556 | 0 |
| 0.9812500000000001 | 0 |
| 0.9819444444444444 | 0 |
| 0.9826388888888888 | 0 |
| 0.9833333333333334 | 0 |
| 0.9840277777777778 | 0 |
| 0.9847222222222222 | 0 |
| 0.9854166666666666 | 0 |
| 0.9861111111111112 | 0 |
| 0.9868055555555556 | 0 |
| 0.9874999999999999 | 0 |
| 0.9881944444444444 | 0 |
| 0.9888888888888889 | 0 |
| 0.9895833333333334 | 0 |
| 0.9902777777777777 | 0 |
| 0.9909722222222223 | 0 |
| 0.9916666666666667 | 0 |
| 0.9923611111111111 | 0 |
| 0.9930555555555555 | 0 |
| 0.99375 | 0 |
| 0.9944444444444445 | 0 |
| 0.9951388888888889 | 0 |
| 0.9958333333333332 | 0 |
| 0.9965277777777778 | 0 |
| 0.9972222222222222 | 0 |
| 0.9979166666666667 | 0 |
| 0.998611111111111 | 0 |
| 0.9993055555555556 | 0 |